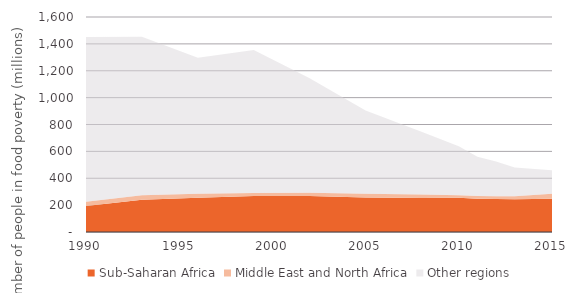
| Category | Sub-Saharan Africa | Middle East and North Africa | Other regions |
|---|---|---|---|
| 1990.0 | 194.074 | 30.858 | 1225.723 |
| 1993.0 | 240.65 | 32.797 | 1180.175 |
| 1996.0 | 255.262 | 30.32 | 1010.398 |
| 1999.0 | 268.523 | 22.514 | 1063.067 |
| 2002.0 | 268.363 | 23.373 | 853.03 |
| 2005.0 | 257.377 | 26.569 | 619.575 |
| 2008.0 | 253.078 | 25.243 | 468.191 |
| 2010.0 | 254.585 | 19.161 | 364.976 |
| 2011.0 | 248.166 | 20.458 | 292.029 |
| 2012.0 | 245.005 | 21.372 | 257.825 |
| 2013.0 | 242.852 | 23.813 | 213.389 |
| 2015.0 | 247.481 | 36.359 | 175.958 |